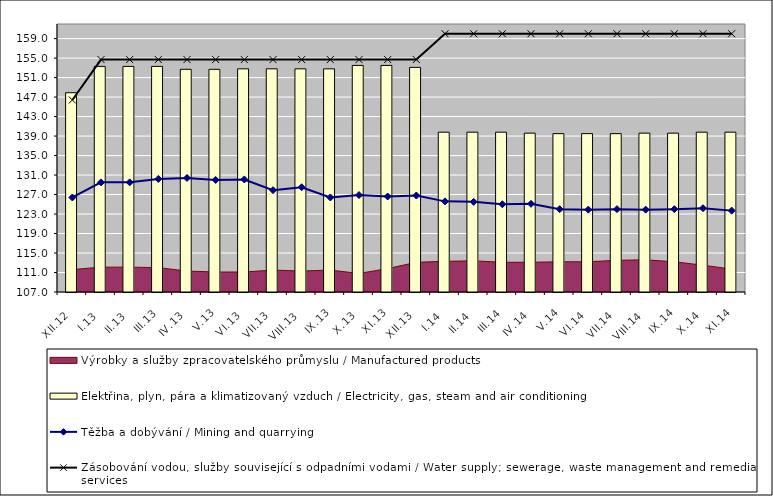
| Category | Elektřina, plyn, pára a klimatizovaný vzduch / Electricity, gas, steam and air conditioning |
|---|---|
| XII.12 | 147.9 |
| I.13 | 153.3 |
| II.13 | 153.3 |
| III.13 | 153.3 |
| IV.13 | 152.7 |
| V.13 | 152.7 |
| VI.13 | 152.8 |
| VII.13 | 152.8 |
| VIII.13 | 152.8 |
| IX.13 | 152.8 |
| X.13 | 153.5 |
| XI.13 | 153.5 |
| XII.13 | 153.1 |
| I.14 | 139.8 |
| II.14 | 139.8 |
| III.14 | 139.8 |
| IV.14 | 139.6 |
| V.14 | 139.5 |
| VI.14 | 139.5 |
| VII.14 | 139.5 |
| VIII.14 | 139.6 |
| IX.14 | 139.6 |
| X.14 | 139.8 |
| XI.14 | 139.8 |